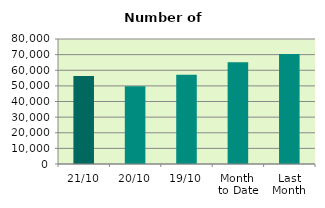
| Category | Series 0 |
|---|---|
| 21/10 | 56310 |
| 20/10 | 49762 |
| 19/10 | 57186 |
| Month 
to Date | 65066.133 |
| Last
Month | 70459.909 |